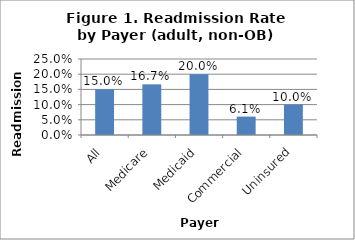
| Category | General Readmissions Rate |
|---|---|
| All | 0.15 |
| Medicare | 0.167 |
| Medicaid | 0.2 |
| Commercial | 0.061 |
| Uninsured | 0.1 |